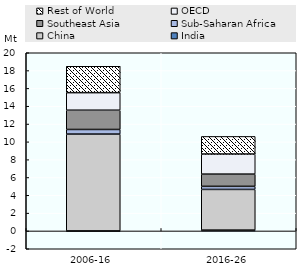
| Category | India | China | Sub-Saharan Africa | Southeast Asia | OECD | Rest of World |
|---|---|---|---|---|---|---|
| 2006-16 | -0.067 | 10.873 | 0.517 | 2.163 | 1.969 | 2.961 |
| 2016-26 | 0.093 | 4.567 | 0.345 | 1.374 | 2.254 | 1.975 |